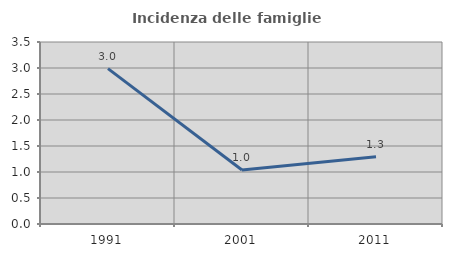
| Category | Incidenza delle famiglie numerose |
|---|---|
| 1991.0 | 2.989 |
| 2001.0 | 1.039 |
| 2011.0 | 1.292 |